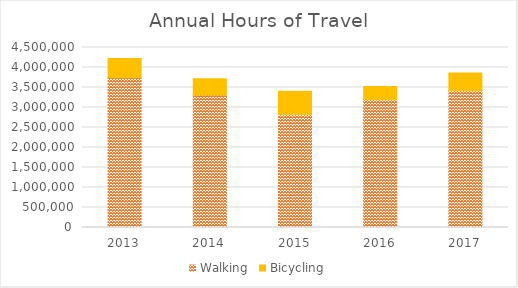
| Category | Walking | Bicycling |
|---|---|---|
| 2013 | 3744015.32 | 481073.687 |
| 2014 | 3306063.439 | 415077.26 |
| 2015 | 2822542.173 | 583167.912 |
| 2016 | 3192747.647 | 334241.464 |
| 2017 | 3420356.013 | 440195.548 |